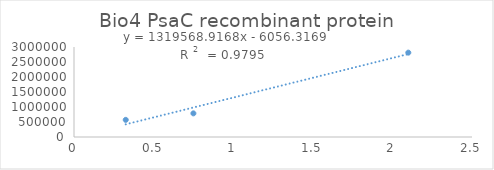
| Category | Series 0 |
|---|---|
| 2.1 | 2811926.81 |
| 0.75 | 787792.34 |
| 0.325 | 571743.21 |